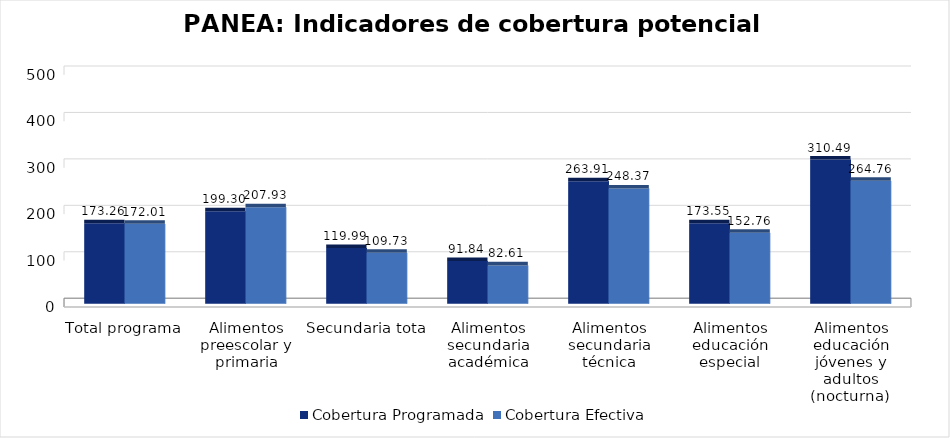
| Category | Cobertura Programada | Cobertura Efectiva |
|---|---|---|
| Total programa | 173.262 | 172.013 |
| Alimentos preescolar y primaria | 199.302 | 207.928 |
| Secundaria total | 119.988 | 109.733 |
| Alimentos secundaria académica | 91.835 | 82.613 |
| Alimentos secundaria técnica | 263.91 | 248.374 |
| Alimentos educación especial | 173.546 | 152.758 |
| Alimentos educación jóvenes y adultos (nocturna)  | 310.485 | 264.764 |